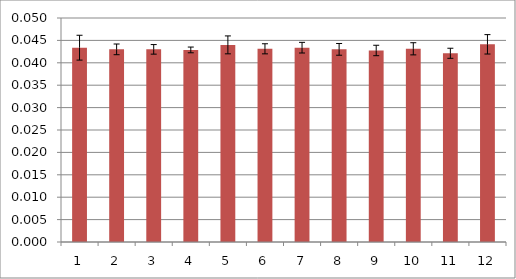
| Category | Series 1 |
|---|---|
| 0 | 0.043 |
| 1 | 0.043 |
| 2 | 0.043 |
| 3 | 0.043 |
| 4 | 0.044 |
| 5 | 0.043 |
| 6 | 0.043 |
| 7 | 0.043 |
| 8 | 0.043 |
| 9 | 0.043 |
| 10 | 0.042 |
| 11 | 0.044 |